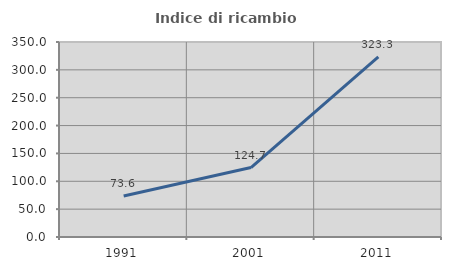
| Category | Indice di ricambio occupazionale  |
|---|---|
| 1991.0 | 73.551 |
| 2001.0 | 124.71 |
| 2011.0 | 323.284 |